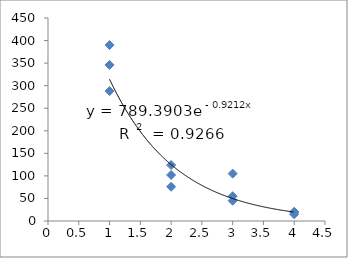
| Category | Series 0 |
|---|---|
| 1.0 | 346 |
| 1.0 | 390 |
| 1.0 | 288 |
| 2.0 | 124 |
| 2.0 | 102 |
| 2.0 | 76 |
| 3.0 | 45 |
| 3.0 | 105 |
| 3.0 | 55 |
| 4.0 | 20 |
| 4.0 | 15 |
| 4.0 | 20 |